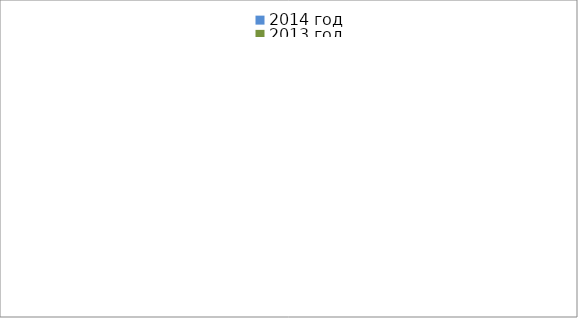
| Category | 2014 год | 2013 год |
|---|---|---|
|  - поджог | 9 | 20 |
|  - неосторожное обращение с огнём | 20 | 22 |
|  - НПТЭ электрооборудования | 11 | 17 |
|  - НПУ и Э печей | 42 | 33 |
|  - НПУ и Э транспортных средств | 37 | 42 |
|   -Шалость с огнем детей | 0 | 3 |
|  -НППБ при эксплуатации эл.приборов | 15 | 17 |
|  - курение | 10 | 8 |
| - прочие | 49 | 41 |
| - не установленные причины | 10 | 1 |